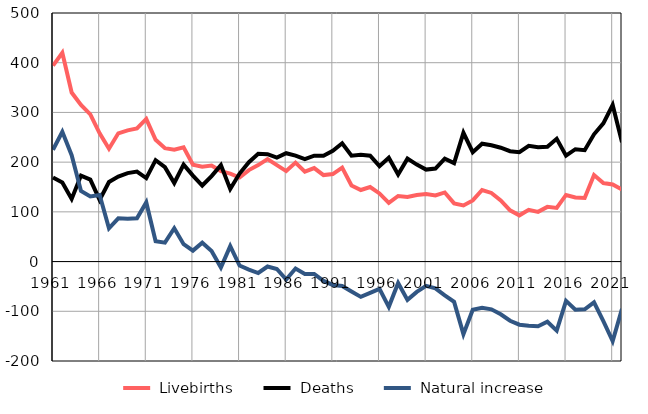
| Category |  Livebirths |  Deaths |  Natural increase |
|---|---|---|---|
| 1961.0 | 394 | 169 | 225 |
| 1962.0 | 420 | 159 | 261 |
| 1963.0 | 340 | 126 | 214 |
| 1964.0 | 315 | 173 | 142 |
| 1965.0 | 296 | 165 | 131 |
| 1966.0 | 258 | 124 | 134 |
| 1967.0 | 227 | 160 | 67 |
| 1968.0 | 258 | 171 | 87 |
| 1969.0 | 264 | 178 | 86 |
| 1970.0 | 268 | 181 | 87 |
| 1971.0 | 287 | 168 | 119 |
| 1972.0 | 245 | 204 | 41 |
| 1973.0 | 228 | 190 | 38 |
| 1974.0 | 225 | 158 | 67 |
| 1975.0 | 230 | 195 | 35 |
| 1976.0 | 195 | 173 | 22 |
| 1977.0 | 191 | 153 | 38 |
| 1978.0 | 193 | 172 | 21 |
| 1979.0 | 182 | 194 | -12 |
| 1980.0 | 177 | 146 | 31 |
| 1981.0 | 169 | 177 | -8 |
| 1982.0 | 184 | 200 | -16 |
| 1983.0 | 194 | 217 | -23 |
| 1984.0 | 206 | 216 | -10 |
| 1985.0 | 194 | 209 | -15 |
| 1986.0 | 182 | 218 | -36 |
| 1987.0 | 199 | 213 | -14 |
| 1988.0 | 181 | 206 | -25 |
| 1989.0 | 188 | 213 | -25 |
| 1990.0 | 174 | 213 | -39 |
| 1991.0 | 176 | 223 | -47 |
| 1992.0 | 189 | 238 | -49 |
| 1993.0 | 153 | 213 | -60 |
| 1994.0 | 144 | 215 | -71 |
| 1995.0 | 150 | 213 | -63 |
| 1996.0 | 137 | 192 | -55 |
| 1997.0 | 118 | 209 | -91 |
| 1998.0 | 132 | 175 | -43 |
| 1999.0 | 130 | 207 | -77 |
| 2000.0 | 134 | 195 | -61 |
| 2001.0 | 136 | 185 | -49 |
| 2002.0 | 133 | 187 | -54 |
| 2003.0 | 139 | 207 | -68 |
| 2004.0 | 117 | 198 | -81 |
| 2005.0 | 113 | 259 | -146 |
| 2006.0 | 123 | 220 | -97 |
| 2007.0 | 144 | 237 | -93 |
| 2008.0 | 138 | 234 | -96 |
| 2009.0 | 123 | 229 | -106 |
| 2010.0 | 103 | 222 | -119 |
| 2011.0 | 93 | 220 | -127 |
| 2012.0 | 104 | 233 | -129 |
| 2013.0 | 100 | 230 | -130 |
| 2014.0 | 110 | 231 | -121 |
| 2015.0 | 108 | 247 | -139 |
| 2016.0 | 134 | 213 | -79 |
| 2017.0 | 129 | 226 | -97 |
| 2018.0 | 128 | 224 | -96 |
| 2019.0 | 174 | 256 | -82 |
| 2020.0 | 158 | 278 | -120 |
| 2021.0 | 155 | 315 | -160 |
| 2022.0 | 145 | 240 | -95 |